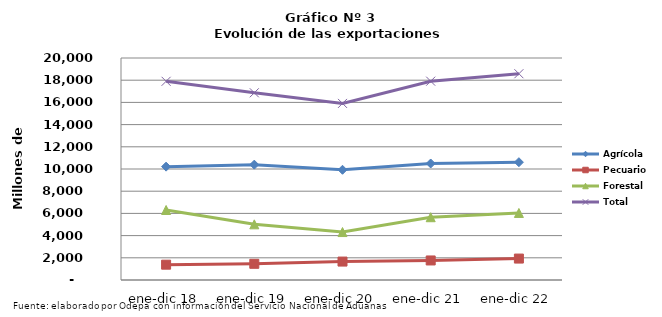
| Category | Agrícola | Pecuario | Forestal | Total |
|---|---|---|---|---|
| ene-dic 18 | 10212418 | 1380778 | 6307561 | 17900757 |
| ene-dic 19 | 10391585 | 1458553 | 5015413 | 16865551 |
| ene-dic 20 | 9929878 | 1660483 | 4319256 | 15909617 |
| ene-dic 21 | 10496670 | 1759688 | 5655304 | 17911662 |
| ene-dic 22 | 10612671 | 1931207 | 6039570 | 18583448 |